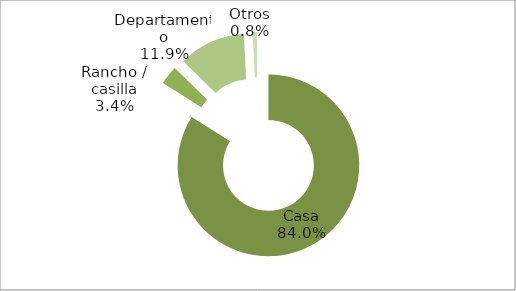
| Category | Series 0 |
|---|---|
| Casa | 83.957 |
| Rancho / casilla | 3.363 |
| Departamento | 11.928 |
| Otros | 0.753 |